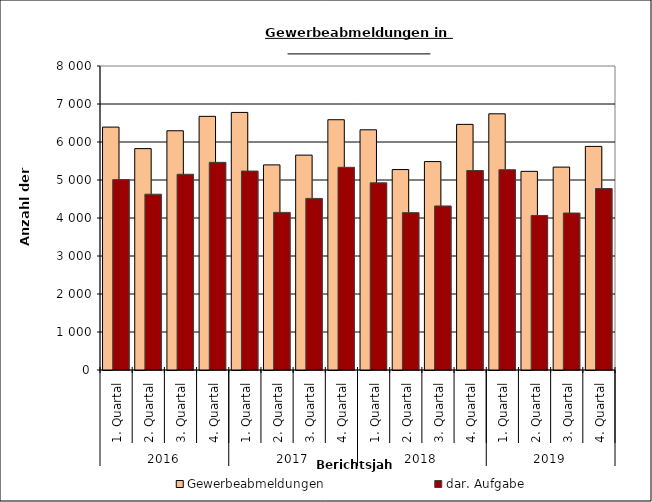
| Category | Gewerbeabmeldungen | dar. Aufgabe |
|---|---|---|
| 0 | 6392 | 5010 |
| 1 | 5826 | 4626 |
| 2 | 6296 | 5151 |
| 3 | 6675 | 5465 |
| 4 | 6778 | 5236 |
| 5 | 5398 | 4148 |
| 6 | 5655 | 4516 |
| 7 | 6586 | 5334 |
| 8 | 6321 | 4925 |
| 9 | 5275 | 4141 |
| 10 | 5485 | 4317 |
| 11 | 6464 | 5250 |
| 12 | 6742 | 5271 |
| 13 | 5228 | 4067 |
| 14 | 5339 | 4131 |
| 15 | 5884 | 4776 |